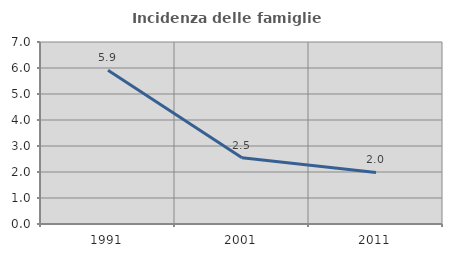
| Category | Incidenza delle famiglie numerose |
|---|---|
| 1991.0 | 5.914 |
| 2001.0 | 2.548 |
| 2011.0 | 1.983 |